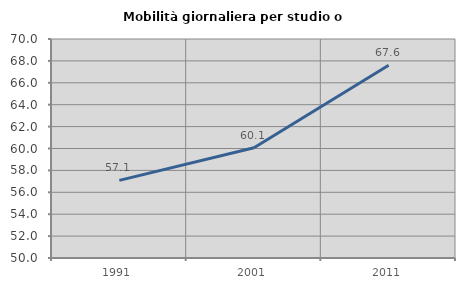
| Category | Mobilità giornaliera per studio o lavoro |
|---|---|
| 1991.0 | 57.088 |
| 2001.0 | 60.073 |
| 2011.0 | 67.601 |